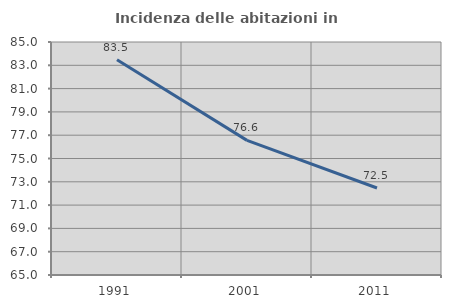
| Category | Incidenza delle abitazioni in proprietà  |
|---|---|
| 1991.0 | 83.48 |
| 2001.0 | 76.557 |
| 2011.0 | 72.466 |